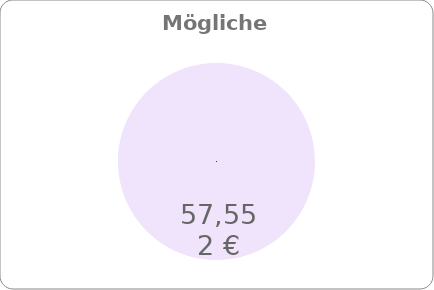
| Category | Series 0 |
|---|---|
| 0 | 57552 |